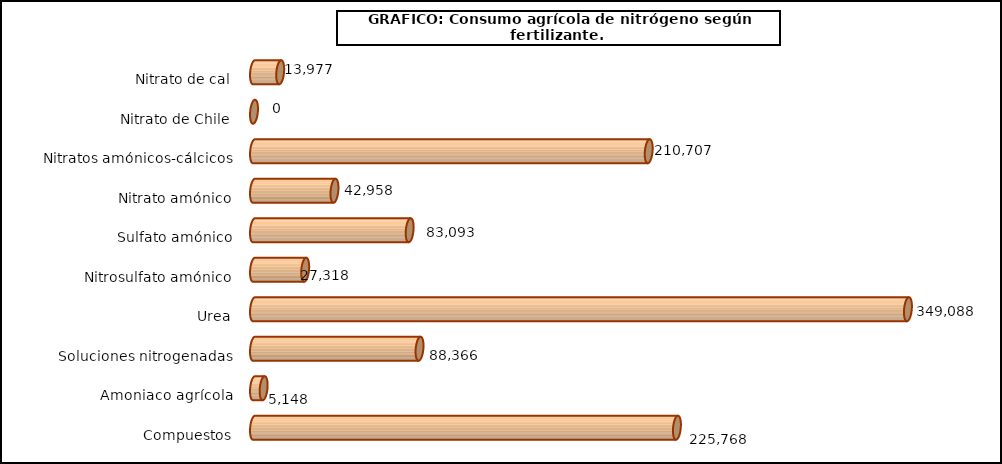
| Category | fert. N |
|---|---|
| 0 | 13977 |
| 1 | 0 |
| 2 | 210707 |
| 3 | 42958 |
| 4 | 83093 |
| 5 | 27318 |
| 6 | 349088 |
| 7 | 88366 |
| 8 | 5148 |
| 9 | 225768 |